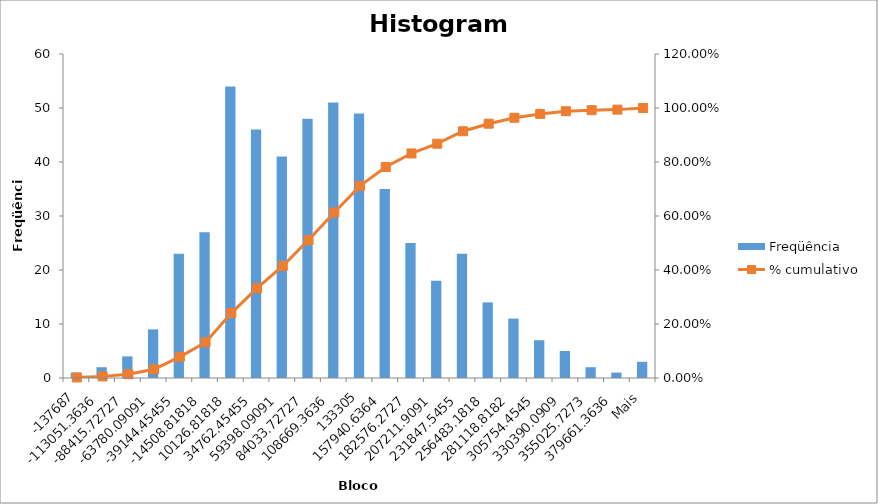
| Category | Freqüência |
|---|---|
| -137687 | 1 |
| -113051,3636 | 2 |
| -88415,72727 | 4 |
| -63780,09091 | 9 |
| -39144,45455 | 23 |
| -14508,81818 | 27 |
| 10126,81818 | 54 |
| 34762,45455 | 46 |
| 59398,09091 | 41 |
| 84033,72727 | 48 |
| 108669,3636 | 51 |
| 133305 | 49 |
| 157940,6364 | 35 |
| 182576,2727 | 25 |
| 207211,9091 | 18 |
| 231847,5455 | 23 |
| 256483,1818 | 14 |
| 281118,8182 | 11 |
| 305754,4545 | 7 |
| 330390,0909 | 5 |
| 355025,7273 | 2 |
| 379661,3636 | 1 |
| Mais | 3 |